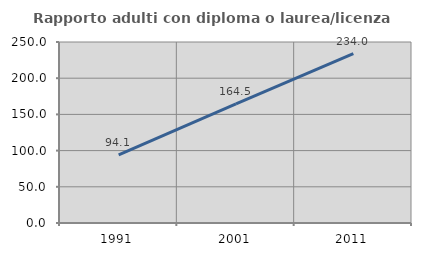
| Category | Rapporto adulti con diploma o laurea/licenza media  |
|---|---|
| 1991.0 | 94.118 |
| 2001.0 | 164.474 |
| 2011.0 | 233.981 |